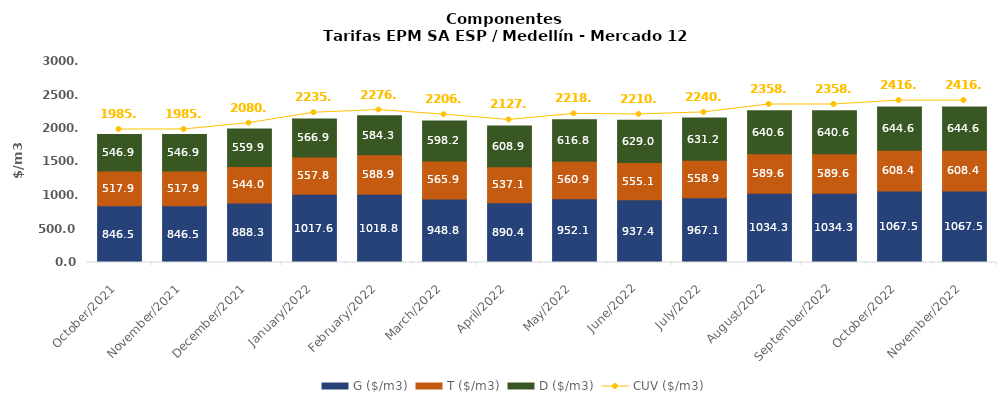
| Category | G ($/m3) | T ($/m3) | D ($/m3) |
|---|---|---|---|
| 2021-10-01 | 846.46 | 517.88 | 546.94 |
| 2021-11-01 | 846.46 | 517.88 | 546.94 |
| 2021-12-01 | 888.25 | 543.96 | 559.88 |
| 2022-01-01 | 1017.59 | 557.8 | 566.91 |
| 2022-02-01 | 1018.83 | 588.88 | 584.28 |
| 2022-03-01 | 948.81 | 565.86 | 598.22 |
| 2022-04-01 | 890.41 | 537.06 | 608.87 |
| 2022-05-01 | 952.08 | 560.91 | 616.84 |
| 2022-06-01 | 937.38 | 555.07 | 629.04 |
| 2022-07-01 | 967.08 | 558.87 | 631.23 |
| 2022-08-01 | 1034.31 | 589.64 | 640.63 |
| 2022-09-01 | 1034.31 | 589.64 | 640.63 |
| 2022-10-01 | 1067.51 | 608.44 | 644.64 |
| 2022-11-01 | 1067.51 | 608.44 | 644.64 |